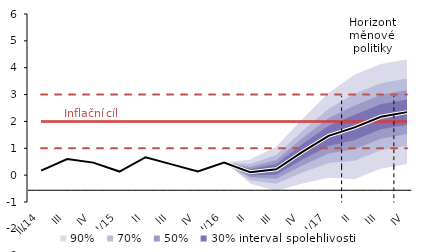
| Category | Inflation Target | Inflation Target - lower bound | Inflation Target - upper bound | linka | Střed předpovědi |
|---|---|---|---|---|---|
| II/14 | 2 | 1 | 3 | 0.167 | 0.167 |
| III | 2 | 1 | 3 | 0.6 | 0.6 |
| IV | 2 | 1 | 3 | 0.467 | 0.467 |
| I/15 | 2 | 1 | 3 | 0.133 | 0.133 |
| II | 2 | 1 | 3 | 0.667 | 0.667 |
| III | 2 | 1 | 3 | 0.4 | 0.4 |
| IV | 2 | 1 | 3 | 0.133 | 0.133 |
| I/16 | 2 | 1 | 3 | 0.467 | 0.467 |
| II | 2 | 1 | 3 | 0.112 | 0.112 |
| III | 2 | 1 | 3 | 0.217 | 0.217 |
| IV | 2 | 1 | 3 | 0.869 | 0.869 |
| I/17 | 2 | 1 | 3 | 1.463 | 1.463 |
| II | 2 | 1 | 3 | 1.78 | 1.78 |
| III | 2 | 1 | 3 | 2.173 | 2.173 |
| IV | 2 | 1 | 3 | 2.347 | 2.347 |